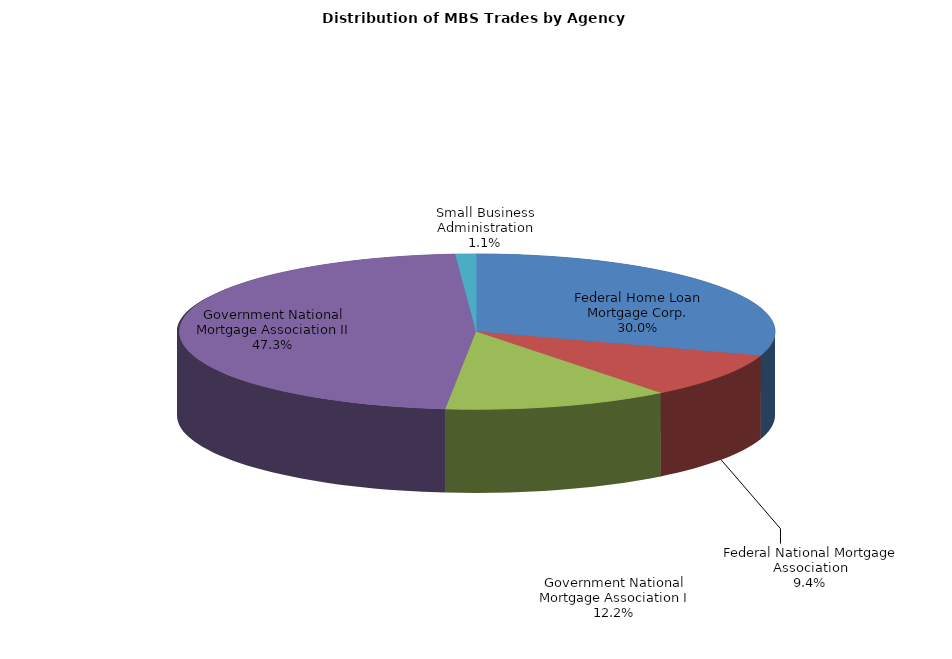
| Category | Series 0 |
|---|---|
| Federal Home Loan Mortgage Corp. | 437.466 |
| Federal National Mortgage Association | 137.621 |
| Government National Mortgage Association I | 178.186 |
| Government National Mortgage Association II | 689.518 |
| Small Business Administration | 16.154 |